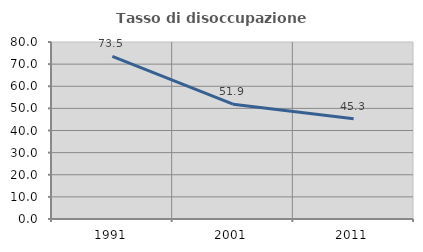
| Category | Tasso di disoccupazione giovanile  |
|---|---|
| 1991.0 | 73.542 |
| 2001.0 | 51.892 |
| 2011.0 | 45.349 |